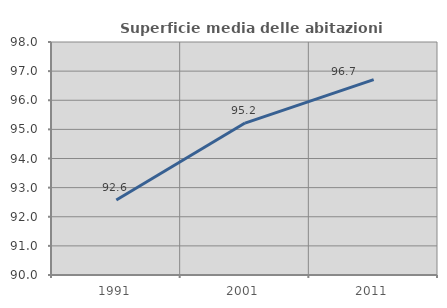
| Category | Superficie media delle abitazioni occupate |
|---|---|
| 1991.0 | 92.578 |
| 2001.0 | 95.217 |
| 2011.0 | 96.708 |